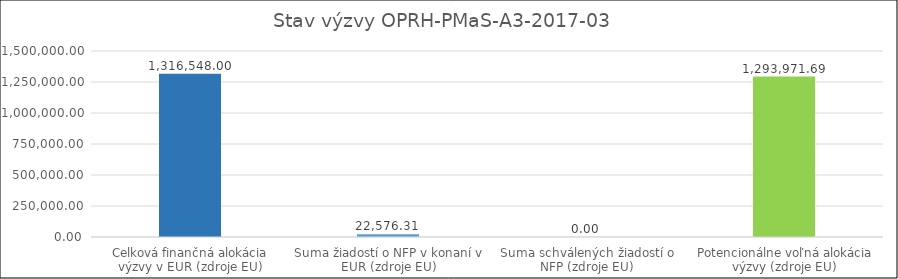
| Category | Stav výzvy OPRH-PMaS-A3-2017-03   |
|---|---|
| Celková finančná alokácia výzvy v EUR (zdroje EU) | 1316548 |
| Suma žiadostí o NFP v konaní v EUR (zdroje EU) | 22576.31 |
| Suma schválených žiadostí o NFP (zdroje EU) | 0 |
| Potencionálne voľná alokácia výzvy (zdroje EU) | 1293971.69 |